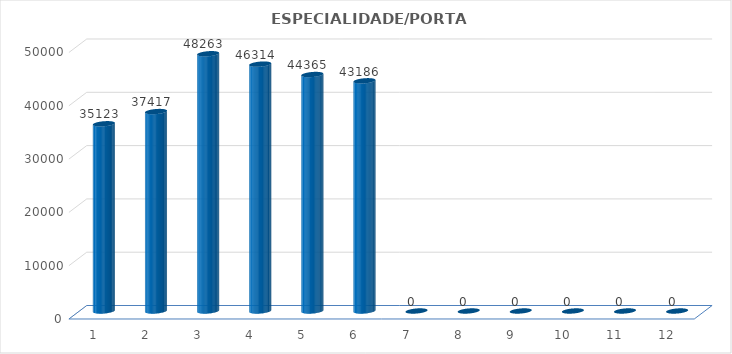
| Category | Series 0 |
|---|---|
| 0 | 35123 |
| 1 | 37417 |
| 2 | 48263 |
| 3 | 46314 |
| 4 | 44365 |
| 5 | 43186 |
| 6 | 0 |
| 7 | 0 |
| 8 | 0 |
| 9 | 0 |
| 10 | 0 |
| 11 | 0 |